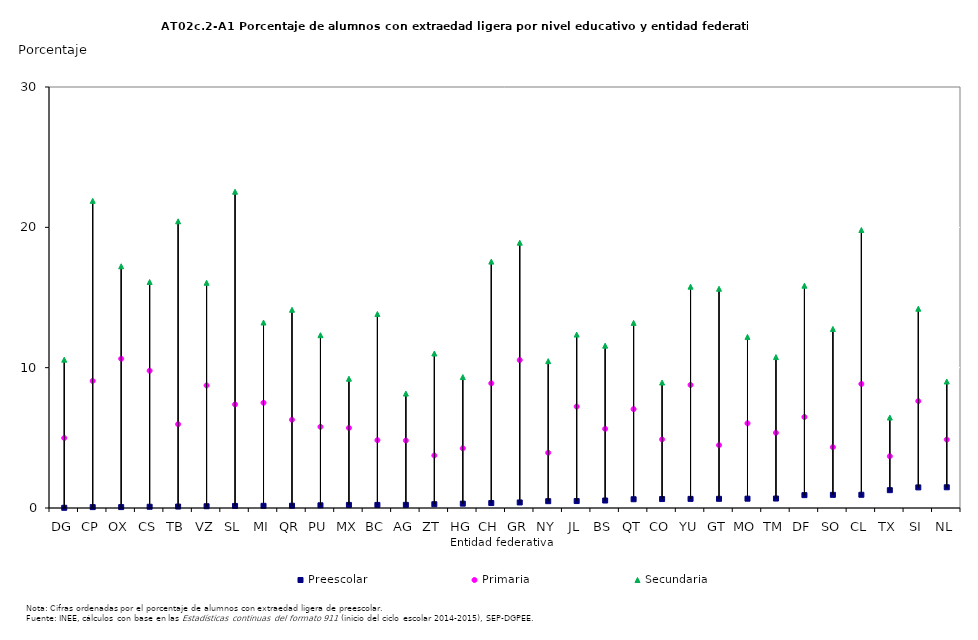
| Category | Preescolar | Primaria | Secundaria |
|---|---|---|---|
| DG | 0.015 | 4.987 | 10.569 |
| CP | 0.062 | 9.054 | 21.889 |
| OX | 0.064 | 10.633 | 17.225 |
| CS | 0.089 | 9.784 | 16.106 |
| TB | 0.103 | 5.972 | 20.428 |
| VZ | 0.126 | 8.734 | 16.051 |
| SL | 0.147 | 7.383 | 22.538 |
| MI | 0.156 | 7.499 | 13.217 |
| QR | 0.162 | 6.285 | 14.127 |
| PU | 0.193 | 5.788 | 12.314 |
| MX | 0.219 | 5.706 | 9.213 |
| BC | 0.22 | 4.832 | 13.825 |
| AG | 0.224 | 4.807 | 8.154 |
| ZT | 0.27 | 3.744 | 11.01 |
| HG | 0.31 | 4.253 | 9.33 |
| CH | 0.353 | 8.887 | 17.558 |
| GR | 0.395 | 10.542 | 18.907 |
| NY | 0.486 | 3.936 | 10.466 |
| JL | 0.495 | 7.227 | 12.359 |
| BS | 0.533 | 5.638 | 11.569 |
| QT | 0.624 | 7.046 | 13.191 |
| CO | 0.638 | 4.89 | 8.941 |
| YU | 0.65 | 8.769 | 15.772 |
| GT | 0.655 | 4.481 | 15.626 |
| MO | 0.664 | 6.034 | 12.191 |
| TM | 0.674 | 5.356 | 10.754 |
| DF | 0.917 | 6.485 | 15.842 |
| SO | 0.937 | 4.338 | 12.761 |
| CL | 0.941 | 8.84 | 19.808 |
| TX | 1.271 | 3.688 | 6.446 |
| SI | 1.468 | 7.617 | 14.201 |
| NL | 1.476 | 4.873 | 9.015 |